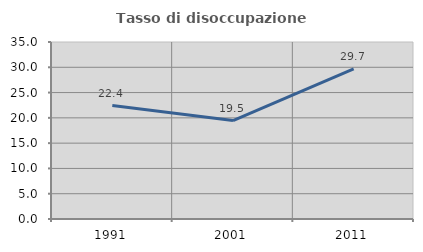
| Category | Tasso di disoccupazione giovanile  |
|---|---|
| 1991.0 | 22.426 |
| 2001.0 | 19.463 |
| 2011.0 | 29.694 |